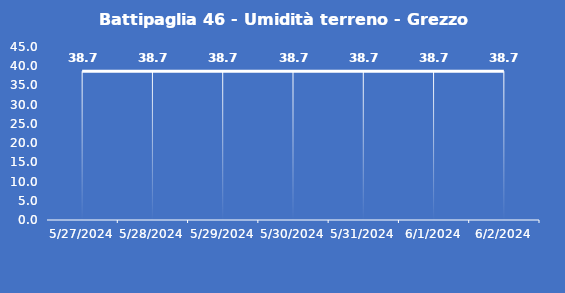
| Category | Battipaglia 46 - Umidità terreno - Grezzo (%VWC) |
|---|---|
| 5/27/24 | 38.7 |
| 5/28/24 | 38.7 |
| 5/29/24 | 38.7 |
| 5/30/24 | 38.7 |
| 5/31/24 | 38.7 |
| 6/1/24 | 38.7 |
| 6/2/24 | 38.7 |